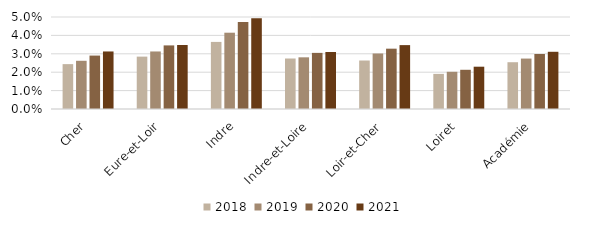
| Category | 2018 | 2019 | 2020 | 2021 |
|---|---|---|---|---|
| Cher | 0.024 | 0.026 | 0.029 | 0.031 |
| Eure-et-Loir | 0.028 | 0.031 | 0.035 | 0.035 |
| Indre | 0.036 | 0.041 | 0.047 | 0.049 |
| Indre-et-Loire | 0.027 | 0.028 | 0.031 | 0.031 |
| Loir-et-Cher | 0.026 | 0.03 | 0.033 | 0.035 |
| Loiret | 0.019 | 0.02 | 0.021 | 0.023 |
| Académie | 0.025 | 0.027 | 0.03 | 0.031 |